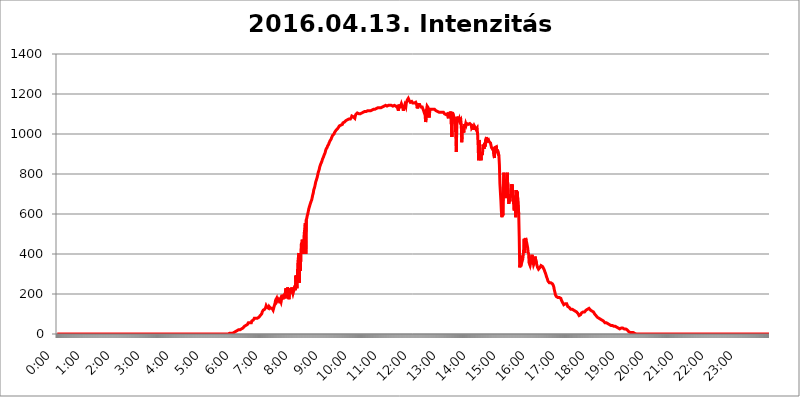
| Category | 2016.04.13. Intenzitás [W/m^2] |
|---|---|
| 0.0 | 0 |
| 0.0006944444444444445 | 0 |
| 0.001388888888888889 | 0 |
| 0.0020833333333333333 | 0 |
| 0.002777777777777778 | 0 |
| 0.003472222222222222 | 0 |
| 0.004166666666666667 | 0 |
| 0.004861111111111111 | 0 |
| 0.005555555555555556 | 0 |
| 0.0062499999999999995 | 0 |
| 0.006944444444444444 | 0 |
| 0.007638888888888889 | 0 |
| 0.008333333333333333 | 0 |
| 0.009027777777777779 | 0 |
| 0.009722222222222222 | 0 |
| 0.010416666666666666 | 0 |
| 0.011111111111111112 | 0 |
| 0.011805555555555555 | 0 |
| 0.012499999999999999 | 0 |
| 0.013194444444444444 | 0 |
| 0.013888888888888888 | 0 |
| 0.014583333333333332 | 0 |
| 0.015277777777777777 | 0 |
| 0.015972222222222224 | 0 |
| 0.016666666666666666 | 0 |
| 0.017361111111111112 | 0 |
| 0.018055555555555557 | 0 |
| 0.01875 | 0 |
| 0.019444444444444445 | 0 |
| 0.02013888888888889 | 0 |
| 0.020833333333333332 | 0 |
| 0.02152777777777778 | 0 |
| 0.022222222222222223 | 0 |
| 0.02291666666666667 | 0 |
| 0.02361111111111111 | 0 |
| 0.024305555555555556 | 0 |
| 0.024999999999999998 | 0 |
| 0.025694444444444447 | 0 |
| 0.02638888888888889 | 0 |
| 0.027083333333333334 | 0 |
| 0.027777777777777776 | 0 |
| 0.02847222222222222 | 0 |
| 0.029166666666666664 | 0 |
| 0.029861111111111113 | 0 |
| 0.030555555555555555 | 0 |
| 0.03125 | 0 |
| 0.03194444444444445 | 0 |
| 0.03263888888888889 | 0 |
| 0.03333333333333333 | 0 |
| 0.034027777777777775 | 0 |
| 0.034722222222222224 | 0 |
| 0.035416666666666666 | 0 |
| 0.036111111111111115 | 0 |
| 0.03680555555555556 | 0 |
| 0.0375 | 0 |
| 0.03819444444444444 | 0 |
| 0.03888888888888889 | 0 |
| 0.03958333333333333 | 0 |
| 0.04027777777777778 | 0 |
| 0.04097222222222222 | 0 |
| 0.041666666666666664 | 0 |
| 0.042361111111111106 | 0 |
| 0.04305555555555556 | 0 |
| 0.043750000000000004 | 0 |
| 0.044444444444444446 | 0 |
| 0.04513888888888889 | 0 |
| 0.04583333333333334 | 0 |
| 0.04652777777777778 | 0 |
| 0.04722222222222222 | 0 |
| 0.04791666666666666 | 0 |
| 0.04861111111111111 | 0 |
| 0.049305555555555554 | 0 |
| 0.049999999999999996 | 0 |
| 0.05069444444444445 | 0 |
| 0.051388888888888894 | 0 |
| 0.052083333333333336 | 0 |
| 0.05277777777777778 | 0 |
| 0.05347222222222222 | 0 |
| 0.05416666666666667 | 0 |
| 0.05486111111111111 | 0 |
| 0.05555555555555555 | 0 |
| 0.05625 | 0 |
| 0.05694444444444444 | 0 |
| 0.057638888888888885 | 0 |
| 0.05833333333333333 | 0 |
| 0.05902777777777778 | 0 |
| 0.059722222222222225 | 0 |
| 0.06041666666666667 | 0 |
| 0.061111111111111116 | 0 |
| 0.06180555555555556 | 0 |
| 0.0625 | 0 |
| 0.06319444444444444 | 0 |
| 0.06388888888888888 | 0 |
| 0.06458333333333334 | 0 |
| 0.06527777777777778 | 0 |
| 0.06597222222222222 | 0 |
| 0.06666666666666667 | 0 |
| 0.06736111111111111 | 0 |
| 0.06805555555555555 | 0 |
| 0.06874999999999999 | 0 |
| 0.06944444444444443 | 0 |
| 0.07013888888888889 | 0 |
| 0.07083333333333333 | 0 |
| 0.07152777777777779 | 0 |
| 0.07222222222222223 | 0 |
| 0.07291666666666667 | 0 |
| 0.07361111111111111 | 0 |
| 0.07430555555555556 | 0 |
| 0.075 | 0 |
| 0.07569444444444444 | 0 |
| 0.0763888888888889 | 0 |
| 0.07708333333333334 | 0 |
| 0.07777777777777778 | 0 |
| 0.07847222222222222 | 0 |
| 0.07916666666666666 | 0 |
| 0.0798611111111111 | 0 |
| 0.08055555555555556 | 0 |
| 0.08125 | 0 |
| 0.08194444444444444 | 0 |
| 0.08263888888888889 | 0 |
| 0.08333333333333333 | 0 |
| 0.08402777777777777 | 0 |
| 0.08472222222222221 | 0 |
| 0.08541666666666665 | 0 |
| 0.08611111111111112 | 0 |
| 0.08680555555555557 | 0 |
| 0.08750000000000001 | 0 |
| 0.08819444444444445 | 0 |
| 0.08888888888888889 | 0 |
| 0.08958333333333333 | 0 |
| 0.09027777777777778 | 0 |
| 0.09097222222222222 | 0 |
| 0.09166666666666667 | 0 |
| 0.09236111111111112 | 0 |
| 0.09305555555555556 | 0 |
| 0.09375 | 0 |
| 0.09444444444444444 | 0 |
| 0.09513888888888888 | 0 |
| 0.09583333333333333 | 0 |
| 0.09652777777777777 | 0 |
| 0.09722222222222222 | 0 |
| 0.09791666666666667 | 0 |
| 0.09861111111111111 | 0 |
| 0.09930555555555555 | 0 |
| 0.09999999999999999 | 0 |
| 0.10069444444444443 | 0 |
| 0.1013888888888889 | 0 |
| 0.10208333333333335 | 0 |
| 0.10277777777777779 | 0 |
| 0.10347222222222223 | 0 |
| 0.10416666666666667 | 0 |
| 0.10486111111111111 | 0 |
| 0.10555555555555556 | 0 |
| 0.10625 | 0 |
| 0.10694444444444444 | 0 |
| 0.1076388888888889 | 0 |
| 0.10833333333333334 | 0 |
| 0.10902777777777778 | 0 |
| 0.10972222222222222 | 0 |
| 0.1111111111111111 | 0 |
| 0.11180555555555556 | 0 |
| 0.11180555555555556 | 0 |
| 0.1125 | 0 |
| 0.11319444444444444 | 0 |
| 0.11388888888888889 | 0 |
| 0.11458333333333333 | 0 |
| 0.11527777777777777 | 0 |
| 0.11597222222222221 | 0 |
| 0.11666666666666665 | 0 |
| 0.1173611111111111 | 0 |
| 0.11805555555555557 | 0 |
| 0.11944444444444445 | 0 |
| 0.12013888888888889 | 0 |
| 0.12083333333333333 | 0 |
| 0.12152777777777778 | 0 |
| 0.12222222222222223 | 0 |
| 0.12291666666666667 | 0 |
| 0.12291666666666667 | 0 |
| 0.12361111111111112 | 0 |
| 0.12430555555555556 | 0 |
| 0.125 | 0 |
| 0.12569444444444444 | 0 |
| 0.12638888888888888 | 0 |
| 0.12708333333333333 | 0 |
| 0.16875 | 0 |
| 0.12847222222222224 | 0 |
| 0.12916666666666668 | 0 |
| 0.12986111111111112 | 0 |
| 0.13055555555555556 | 0 |
| 0.13125 | 0 |
| 0.13194444444444445 | 0 |
| 0.1326388888888889 | 0 |
| 0.13333333333333333 | 0 |
| 0.13402777777777777 | 0 |
| 0.13402777777777777 | 0 |
| 0.13472222222222222 | 0 |
| 0.13541666666666666 | 0 |
| 0.1361111111111111 | 0 |
| 0.13749999999999998 | 0 |
| 0.13819444444444443 | 0 |
| 0.1388888888888889 | 0 |
| 0.13958333333333334 | 0 |
| 0.14027777777777778 | 0 |
| 0.14097222222222222 | 0 |
| 0.14166666666666666 | 0 |
| 0.1423611111111111 | 0 |
| 0.14305555555555557 | 0 |
| 0.14375000000000002 | 0 |
| 0.14444444444444446 | 0 |
| 0.1451388888888889 | 0 |
| 0.1451388888888889 | 0 |
| 0.14652777777777778 | 0 |
| 0.14722222222222223 | 0 |
| 0.14791666666666667 | 0 |
| 0.1486111111111111 | 0 |
| 0.14930555555555555 | 0 |
| 0.15 | 0 |
| 0.15069444444444444 | 0 |
| 0.15138888888888888 | 0 |
| 0.15208333333333332 | 0 |
| 0.15277777777777776 | 0 |
| 0.15347222222222223 | 0 |
| 0.15416666666666667 | 0 |
| 0.15486111111111112 | 0 |
| 0.15555555555555556 | 0 |
| 0.15625 | 0 |
| 0.15694444444444444 | 0 |
| 0.15763888888888888 | 0 |
| 0.15833333333333333 | 0 |
| 0.15902777777777777 | 0 |
| 0.15972222222222224 | 0 |
| 0.16041666666666668 | 0 |
| 0.16111111111111112 | 0 |
| 0.16180555555555556 | 0 |
| 0.1625 | 0 |
| 0.16319444444444445 | 0 |
| 0.1638888888888889 | 0 |
| 0.16458333333333333 | 0 |
| 0.16527777777777777 | 0 |
| 0.16597222222222222 | 0 |
| 0.16666666666666666 | 0 |
| 0.1673611111111111 | 0 |
| 0.16805555555555554 | 0 |
| 0.16874999999999998 | 0 |
| 0.16944444444444443 | 0 |
| 0.17013888888888887 | 0 |
| 0.1708333333333333 | 0 |
| 0.17152777777777775 | 0 |
| 0.17222222222222225 | 0 |
| 0.1729166666666667 | 0 |
| 0.17361111111111113 | 0 |
| 0.17430555555555557 | 0 |
| 0.17500000000000002 | 0 |
| 0.17569444444444446 | 0 |
| 0.1763888888888889 | 0 |
| 0.17708333333333334 | 0 |
| 0.17777777777777778 | 0 |
| 0.17847222222222223 | 0 |
| 0.17916666666666667 | 0 |
| 0.1798611111111111 | 0 |
| 0.18055555555555555 | 0 |
| 0.18125 | 0 |
| 0.18194444444444444 | 0 |
| 0.1826388888888889 | 0 |
| 0.18333333333333335 | 0 |
| 0.1840277777777778 | 0 |
| 0.18472222222222223 | 0 |
| 0.18541666666666667 | 0 |
| 0.18611111111111112 | 0 |
| 0.18680555555555556 | 0 |
| 0.1875 | 0 |
| 0.18819444444444444 | 0 |
| 0.18888888888888888 | 0 |
| 0.18958333333333333 | 0 |
| 0.19027777777777777 | 0 |
| 0.1909722222222222 | 0 |
| 0.19166666666666665 | 0 |
| 0.19236111111111112 | 0 |
| 0.19305555555555554 | 0 |
| 0.19375 | 0 |
| 0.19444444444444445 | 0 |
| 0.1951388888888889 | 0 |
| 0.19583333333333333 | 0 |
| 0.19652777777777777 | 0 |
| 0.19722222222222222 | 0 |
| 0.19791666666666666 | 0 |
| 0.1986111111111111 | 0 |
| 0.19930555555555554 | 0 |
| 0.19999999999999998 | 0 |
| 0.20069444444444443 | 0 |
| 0.20138888888888887 | 0 |
| 0.2020833333333333 | 0 |
| 0.2027777777777778 | 0 |
| 0.2034722222222222 | 0 |
| 0.2041666666666667 | 0 |
| 0.20486111111111113 | 0 |
| 0.20555555555555557 | 0 |
| 0.20625000000000002 | 0 |
| 0.20694444444444446 | 0 |
| 0.2076388888888889 | 0 |
| 0.20833333333333334 | 0 |
| 0.20902777777777778 | 0 |
| 0.20972222222222223 | 0 |
| 0.21041666666666667 | 0 |
| 0.2111111111111111 | 0 |
| 0.21180555555555555 | 0 |
| 0.2125 | 0 |
| 0.21319444444444444 | 0 |
| 0.2138888888888889 | 0 |
| 0.21458333333333335 | 0 |
| 0.2152777777777778 | 0 |
| 0.21597222222222223 | 0 |
| 0.21666666666666667 | 0 |
| 0.21736111111111112 | 0 |
| 0.21805555555555556 | 0 |
| 0.21875 | 0 |
| 0.21944444444444444 | 0 |
| 0.22013888888888888 | 0 |
| 0.22083333333333333 | 0 |
| 0.22152777777777777 | 0 |
| 0.2222222222222222 | 0 |
| 0.22291666666666665 | 0 |
| 0.2236111111111111 | 0 |
| 0.22430555555555556 | 0 |
| 0.225 | 0 |
| 0.22569444444444445 | 0 |
| 0.2263888888888889 | 0 |
| 0.22708333333333333 | 0 |
| 0.22777777777777777 | 0 |
| 0.22847222222222222 | 0 |
| 0.22916666666666666 | 0 |
| 0.2298611111111111 | 0 |
| 0.23055555555555554 | 0 |
| 0.23124999999999998 | 0 |
| 0.23194444444444443 | 0 |
| 0.23263888888888887 | 0 |
| 0.2333333333333333 | 0 |
| 0.2340277777777778 | 0 |
| 0.2347222222222222 | 0 |
| 0.2354166666666667 | 0 |
| 0.23611111111111113 | 0 |
| 0.23680555555555557 | 0 |
| 0.23750000000000002 | 0 |
| 0.23819444444444446 | 0 |
| 0.2388888888888889 | 0 |
| 0.23958333333333334 | 0 |
| 0.24027777777777778 | 3.525 |
| 0.24097222222222223 | 3.525 |
| 0.24166666666666667 | 3.525 |
| 0.2423611111111111 | 3.525 |
| 0.24305555555555555 | 3.525 |
| 0.24375 | 3.525 |
| 0.24444444444444446 | 3.525 |
| 0.24513888888888888 | 3.525 |
| 0.24583333333333335 | 3.525 |
| 0.2465277777777778 | 7.887 |
| 0.24722222222222223 | 7.887 |
| 0.24791666666666667 | 7.887 |
| 0.24861111111111112 | 7.887 |
| 0.24930555555555556 | 7.887 |
| 0.25 | 12.257 |
| 0.25069444444444444 | 12.257 |
| 0.2513888888888889 | 12.257 |
| 0.2520833333333333 | 16.636 |
| 0.25277777777777777 | 16.636 |
| 0.2534722222222222 | 16.636 |
| 0.25416666666666665 | 21.024 |
| 0.2548611111111111 | 21.024 |
| 0.2555555555555556 | 21.024 |
| 0.25625000000000003 | 21.024 |
| 0.2569444444444445 | 25.419 |
| 0.2576388888888889 | 25.419 |
| 0.25833333333333336 | 25.419 |
| 0.2590277777777778 | 29.823 |
| 0.25972222222222224 | 29.823 |
| 0.2604166666666667 | 29.823 |
| 0.2611111111111111 | 34.234 |
| 0.26180555555555557 | 34.234 |
| 0.2625 | 38.653 |
| 0.26319444444444445 | 38.653 |
| 0.2638888888888889 | 38.653 |
| 0.26458333333333334 | 43.079 |
| 0.2652777777777778 | 43.079 |
| 0.2659722222222222 | 47.511 |
| 0.26666666666666666 | 47.511 |
| 0.2673611111111111 | 51.951 |
| 0.26805555555555555 | 56.398 |
| 0.26875 | 56.398 |
| 0.26944444444444443 | 56.398 |
| 0.2701388888888889 | 56.398 |
| 0.2708333333333333 | 56.398 |
| 0.27152777777777776 | 56.398 |
| 0.2722222222222222 | 56.398 |
| 0.27291666666666664 | 65.31 |
| 0.2736111111111111 | 65.31 |
| 0.2743055555555555 | 69.775 |
| 0.27499999999999997 | 69.775 |
| 0.27569444444444446 | 74.246 |
| 0.27638888888888885 | 78.722 |
| 0.27708333333333335 | 83.205 |
| 0.2777777777777778 | 83.205 |
| 0.27847222222222223 | 78.722 |
| 0.2791666666666667 | 78.722 |
| 0.2798611111111111 | 83.205 |
| 0.28055555555555556 | 78.722 |
| 0.28125 | 78.722 |
| 0.28194444444444444 | 83.205 |
| 0.2826388888888889 | 83.205 |
| 0.2833333333333333 | 83.205 |
| 0.28402777777777777 | 83.205 |
| 0.2847222222222222 | 92.184 |
| 0.28541666666666665 | 96.682 |
| 0.28611111111111115 | 92.184 |
| 0.28680555555555554 | 101.184 |
| 0.28750000000000003 | 110.201 |
| 0.2881944444444445 | 114.716 |
| 0.2888888888888889 | 119.235 |
| 0.28958333333333336 | 119.235 |
| 0.2902777777777778 | 123.758 |
| 0.29097222222222224 | 123.758 |
| 0.2916666666666667 | 128.284 |
| 0.2923611111111111 | 132.814 |
| 0.29305555555555557 | 141.884 |
| 0.29375 | 137.347 |
| 0.29444444444444445 | 132.814 |
| 0.2951388888888889 | 132.814 |
| 0.29583333333333334 | 137.347 |
| 0.2965277777777778 | 128.284 |
| 0.2972222222222222 | 137.347 |
| 0.29791666666666666 | 132.814 |
| 0.2986111111111111 | 137.347 |
| 0.29930555555555555 | 128.284 |
| 0.3 | 128.284 |
| 0.30069444444444443 | 123.758 |
| 0.3013888888888889 | 128.284 |
| 0.3020833333333333 | 132.814 |
| 0.30277777777777776 | 119.235 |
| 0.3034722222222222 | 114.716 |
| 0.30416666666666664 | 137.347 |
| 0.3048611111111111 | 137.347 |
| 0.3055555555555555 | 155.509 |
| 0.30624999999999997 | 169.156 |
| 0.3069444444444444 | 173.709 |
| 0.3076388888888889 | 178.264 |
| 0.30833333333333335 | 164.605 |
| 0.3090277777777778 | 164.605 |
| 0.30972222222222223 | 173.709 |
| 0.3104166666666667 | 173.709 |
| 0.3111111111111111 | 164.605 |
| 0.31180555555555556 | 169.156 |
| 0.3125 | 173.709 |
| 0.31319444444444444 | 178.264 |
| 0.3138888888888889 | 160.056 |
| 0.3145833333333333 | 173.709 |
| 0.31527777777777777 | 196.497 |
| 0.3159722222222222 | 196.497 |
| 0.31666666666666665 | 173.709 |
| 0.31736111111111115 | 187.378 |
| 0.31805555555555554 | 187.378 |
| 0.31875000000000003 | 196.497 |
| 0.3194444444444445 | 182.82 |
| 0.3201388888888889 | 214.746 |
| 0.32083333333333336 | 228.436 |
| 0.3215277777777778 | 178.264 |
| 0.32222222222222224 | 214.746 |
| 0.3229166666666667 | 233 |
| 0.3236111111111111 | 228.436 |
| 0.32430555555555557 | 214.746 |
| 0.325 | 173.709 |
| 0.32569444444444445 | 214.746 |
| 0.3263888888888889 | 201.058 |
| 0.32708333333333334 | 228.436 |
| 0.3277777777777778 | 214.746 |
| 0.3284722222222222 | 223.873 |
| 0.32916666666666666 | 233 |
| 0.3298611111111111 | 210.182 |
| 0.33055555555555555 | 201.058 |
| 0.33125 | 201.058 |
| 0.33194444444444443 | 196.497 |
| 0.3326388888888889 | 228.436 |
| 0.3333333333333333 | 242.127 |
| 0.3340277777777778 | 219.309 |
| 0.3347222222222222 | 292.259 |
| 0.3354166666666667 | 255.813 |
| 0.3361111111111111 | 228.436 |
| 0.3368055555555556 | 296.808 |
| 0.33749999999999997 | 355.712 |
| 0.33819444444444446 | 382.715 |
| 0.33888888888888885 | 405.108 |
| 0.33958333333333335 | 255.813 |
| 0.34027777777777773 | 378.224 |
| 0.34097222222222223 | 314.98 |
| 0.3416666666666666 | 400.638 |
| 0.3423611111111111 | 449.551 |
| 0.3430555555555555 | 458.38 |
| 0.34375 | 471.582 |
| 0.3444444444444445 | 400.638 |
| 0.3451388888888889 | 414.035 |
| 0.3458333333333334 | 471.582 |
| 0.34652777777777777 | 506.542 |
| 0.34722222222222227 | 528.2 |
| 0.34791666666666665 | 553.986 |
| 0.34861111111111115 | 400.638 |
| 0.34930555555555554 | 571.049 |
| 0.35000000000000003 | 579.542 |
| 0.3506944444444444 | 592.233 |
| 0.3513888888888889 | 600.661 |
| 0.3520833333333333 | 613.252 |
| 0.3527777777777778 | 625.784 |
| 0.3534722222222222 | 634.105 |
| 0.3541666666666667 | 642.4 |
| 0.3548611111111111 | 646.537 |
| 0.35555555555555557 | 658.909 |
| 0.35625 | 663.019 |
| 0.35694444444444445 | 671.22 |
| 0.3576388888888889 | 683.473 |
| 0.35833333333333334 | 695.666 |
| 0.3590277777777778 | 703.762 |
| 0.3597222222222222 | 719.877 |
| 0.36041666666666666 | 723.889 |
| 0.3611111111111111 | 735.89 |
| 0.36180555555555555 | 747.834 |
| 0.3625 | 759.723 |
| 0.36319444444444443 | 763.674 |
| 0.3638888888888889 | 775.492 |
| 0.3645833333333333 | 783.342 |
| 0.3652777777777778 | 795.074 |
| 0.3659722222222222 | 806.757 |
| 0.3666666666666667 | 814.519 |
| 0.3673611111111111 | 822.26 |
| 0.3680555555555556 | 833.834 |
| 0.36874999999999997 | 841.526 |
| 0.36944444444444446 | 849.199 |
| 0.37013888888888885 | 845.365 |
| 0.37083333333333335 | 860.676 |
| 0.37152777777777773 | 868.305 |
| 0.37222222222222223 | 875.918 |
| 0.3729166666666666 | 879.719 |
| 0.3736111111111111 | 887.309 |
| 0.3743055555555555 | 894.885 |
| 0.375 | 898.668 |
| 0.3756944444444445 | 906.223 |
| 0.3763888888888889 | 917.534 |
| 0.3770833333333334 | 925.06 |
| 0.37777777777777777 | 928.819 |
| 0.37847222222222227 | 932.576 |
| 0.37916666666666665 | 940.082 |
| 0.37986111111111115 | 943.832 |
| 0.38055555555555554 | 947.58 |
| 0.38125000000000003 | 955.071 |
| 0.3819444444444444 | 958.814 |
| 0.3826388888888889 | 966.295 |
| 0.3833333333333333 | 970.034 |
| 0.3840277777777778 | 973.772 |
| 0.3847222222222222 | 981.244 |
| 0.3854166666666667 | 984.98 |
| 0.3861111111111111 | 992.448 |
| 0.38680555555555557 | 996.182 |
| 0.3875 | 996.182 |
| 0.38819444444444445 | 999.916 |
| 0.3888888888888889 | 1007.383 |
| 0.38958333333333334 | 1007.383 |
| 0.3902777777777778 | 1011.118 |
| 0.3909722222222222 | 1018.587 |
| 0.39166666666666666 | 1018.587 |
| 0.3923611111111111 | 1022.323 |
| 0.39305555555555555 | 1026.06 |
| 0.39375 | 1029.798 |
| 0.39444444444444443 | 1033.537 |
| 0.3951388888888889 | 1033.537 |
| 0.3958333333333333 | 1041.019 |
| 0.3965277777777778 | 1041.019 |
| 0.3972222222222222 | 1044.762 |
| 0.3979166666666667 | 1044.762 |
| 0.3986111111111111 | 1044.762 |
| 0.3993055555555556 | 1048.508 |
| 0.39999999999999997 | 1048.508 |
| 0.40069444444444446 | 1056.004 |
| 0.40138888888888885 | 1056.004 |
| 0.40208333333333335 | 1056.004 |
| 0.40277777777777773 | 1059.756 |
| 0.40347222222222223 | 1059.756 |
| 0.4041666666666666 | 1063.51 |
| 0.4048611111111111 | 1067.267 |
| 0.4055555555555555 | 1071.027 |
| 0.40625 | 1071.027 |
| 0.4069444444444445 | 1071.027 |
| 0.4076388888888889 | 1071.027 |
| 0.4083333333333334 | 1071.027 |
| 0.40902777777777777 | 1074.789 |
| 0.40972222222222227 | 1074.789 |
| 0.41041666666666665 | 1078.555 |
| 0.41111111111111115 | 1074.789 |
| 0.41180555555555554 | 1078.555 |
| 0.41250000000000003 | 1082.324 |
| 0.4131944444444444 | 1089.873 |
| 0.4138888888888889 | 1086.097 |
| 0.4145833333333333 | 1086.097 |
| 0.4152777777777778 | 1086.097 |
| 0.4159722222222222 | 1086.097 |
| 0.4166666666666667 | 1089.873 |
| 0.4173611111111111 | 1078.555 |
| 0.41805555555555557 | 1089.873 |
| 0.41875 | 1097.437 |
| 0.41944444444444445 | 1097.437 |
| 0.4201388888888889 | 1097.437 |
| 0.42083333333333334 | 1105.019 |
| 0.4215277777777778 | 1108.816 |
| 0.4222222222222222 | 1108.816 |
| 0.42291666666666666 | 1101.226 |
| 0.4236111111111111 | 1101.226 |
| 0.42430555555555555 | 1101.226 |
| 0.425 | 1101.226 |
| 0.42569444444444443 | 1101.226 |
| 0.4263888888888889 | 1105.019 |
| 0.4270833333333333 | 1105.019 |
| 0.4277777777777778 | 1105.019 |
| 0.4284722222222222 | 1105.019 |
| 0.4291666666666667 | 1108.816 |
| 0.4298611111111111 | 1108.816 |
| 0.4305555555555556 | 1108.816 |
| 0.43124999999999997 | 1112.618 |
| 0.43194444444444446 | 1112.618 |
| 0.43263888888888885 | 1108.816 |
| 0.43333333333333335 | 1112.618 |
| 0.43402777777777773 | 1108.816 |
| 0.43472222222222223 | 1112.618 |
| 0.4354166666666666 | 1116.426 |
| 0.4361111111111111 | 1116.426 |
| 0.4368055555555555 | 1116.426 |
| 0.4375 | 1116.426 |
| 0.4381944444444445 | 1116.426 |
| 0.4388888888888889 | 1116.426 |
| 0.4395833333333334 | 1116.426 |
| 0.44027777777777777 | 1116.426 |
| 0.44097222222222227 | 1116.426 |
| 0.44166666666666665 | 1120.238 |
| 0.44236111111111115 | 1124.056 |
| 0.44305555555555554 | 1124.056 |
| 0.44375000000000003 | 1124.056 |
| 0.4444444444444444 | 1124.056 |
| 0.4451388888888889 | 1124.056 |
| 0.4458333333333333 | 1124.056 |
| 0.4465277777777778 | 1124.056 |
| 0.4472222222222222 | 1127.879 |
| 0.4479166666666667 | 1127.879 |
| 0.4486111111111111 | 1127.879 |
| 0.44930555555555557 | 1131.708 |
| 0.45 | 1131.708 |
| 0.45069444444444445 | 1131.708 |
| 0.4513888888888889 | 1135.543 |
| 0.45208333333333334 | 1131.708 |
| 0.4527777777777778 | 1131.708 |
| 0.4534722222222222 | 1135.543 |
| 0.45416666666666666 | 1131.708 |
| 0.4548611111111111 | 1135.543 |
| 0.45555555555555555 | 1135.543 |
| 0.45625 | 1135.543 |
| 0.45694444444444443 | 1139.384 |
| 0.4576388888888889 | 1139.384 |
| 0.4583333333333333 | 1139.384 |
| 0.4590277777777778 | 1139.384 |
| 0.4597222222222222 | 1143.232 |
| 0.4604166666666667 | 1143.232 |
| 0.4611111111111111 | 1143.232 |
| 0.4618055555555556 | 1139.384 |
| 0.46249999999999997 | 1139.384 |
| 0.46319444444444446 | 1139.384 |
| 0.46388888888888885 | 1143.232 |
| 0.46458333333333335 | 1143.232 |
| 0.46527777777777773 | 1147.086 |
| 0.46597222222222223 | 1143.232 |
| 0.4666666666666666 | 1143.232 |
| 0.4673611111111111 | 1139.384 |
| 0.4680555555555555 | 1139.384 |
| 0.46875 | 1143.232 |
| 0.4694444444444445 | 1147.086 |
| 0.4701388888888889 | 1147.086 |
| 0.4708333333333334 | 1139.384 |
| 0.47152777777777777 | 1139.384 |
| 0.47222222222222227 | 1139.384 |
| 0.47291666666666665 | 1143.232 |
| 0.47361111111111115 | 1143.232 |
| 0.47430555555555554 | 1143.232 |
| 0.47500000000000003 | 1139.384 |
| 0.4756944444444444 | 1135.543 |
| 0.4763888888888889 | 1139.384 |
| 0.4770833333333333 | 1131.708 |
| 0.4777777777777778 | 1131.708 |
| 0.4784722222222222 | 1116.426 |
| 0.4791666666666667 | 1147.086 |
| 0.4798611111111111 | 1143.232 |
| 0.48055555555555557 | 1135.543 |
| 0.48125 | 1131.708 |
| 0.48194444444444445 | 1143.232 |
| 0.4826388888888889 | 1150.946 |
| 0.48333333333333334 | 1147.086 |
| 0.4840277777777778 | 1135.543 |
| 0.4847222222222222 | 1127.879 |
| 0.48541666666666666 | 1116.426 |
| 0.4861111111111111 | 1131.708 |
| 0.48680555555555555 | 1131.708 |
| 0.4875 | 1147.086 |
| 0.48819444444444443 | 1147.086 |
| 0.4888888888888889 | 1135.543 |
| 0.4895833333333333 | 1154.814 |
| 0.4902777777777778 | 1154.814 |
| 0.4909722222222222 | 1170.358 |
| 0.4916666666666667 | 1174.263 |
| 0.4923611111111111 | 1178.177 |
| 0.4930555555555556 | 1174.263 |
| 0.49374999999999997 | 1166.46 |
| 0.49444444444444446 | 1162.571 |
| 0.49513888888888885 | 1158.689 |
| 0.49583333333333335 | 1158.689 |
| 0.49652777777777773 | 1154.814 |
| 0.49722222222222223 | 1162.571 |
| 0.4979166666666666 | 1162.571 |
| 0.4986111111111111 | 1154.814 |
| 0.4993055555555555 | 1154.814 |
| 0.5 | 1154.814 |
| 0.5006944444444444 | 1154.814 |
| 0.5013888888888889 | 1150.946 |
| 0.5020833333333333 | 1154.814 |
| 0.5027777777777778 | 1158.689 |
| 0.5034722222222222 | 1154.814 |
| 0.5041666666666667 | 1147.086 |
| 0.5048611111111111 | 1127.879 |
| 0.5055555555555555 | 1127.879 |
| 0.50625 | 1147.086 |
| 0.5069444444444444 | 1147.086 |
| 0.5076388888888889 | 1147.086 |
| 0.5083333333333333 | 1147.086 |
| 0.5090277777777777 | 1143.232 |
| 0.5097222222222222 | 1135.543 |
| 0.5104166666666666 | 1135.543 |
| 0.5111111111111112 | 1135.543 |
| 0.5118055555555555 | 1135.543 |
| 0.5125000000000001 | 1135.543 |
| 0.5131944444444444 | 1139.384 |
| 0.513888888888889 | 1116.426 |
| 0.5145833333333333 | 1116.426 |
| 0.5152777777777778 | 1116.426 |
| 0.5159722222222222 | 1093.653 |
| 0.5166666666666667 | 1059.756 |
| 0.517361111111111 | 1078.555 |
| 0.5180555555555556 | 1124.056 |
| 0.5187499999999999 | 1139.384 |
| 0.5194444444444445 | 1135.543 |
| 0.5201388888888888 | 1131.708 |
| 0.5208333333333334 | 1131.708 |
| 0.5215277777777778 | 1082.324 |
| 0.5222222222222223 | 1105.019 |
| 0.5229166666666667 | 1124.056 |
| 0.5236111111111111 | 1124.056 |
| 0.5243055555555556 | 1120.238 |
| 0.525 | 1124.056 |
| 0.5256944444444445 | 1124.056 |
| 0.5263888888888889 | 1120.238 |
| 0.5270833333333333 | 1124.056 |
| 0.5277777777777778 | 1124.056 |
| 0.5284722222222222 | 1124.056 |
| 0.5291666666666667 | 1124.056 |
| 0.5298611111111111 | 1120.238 |
| 0.5305555555555556 | 1124.056 |
| 0.53125 | 1116.426 |
| 0.5319444444444444 | 1116.426 |
| 0.5326388888888889 | 1116.426 |
| 0.5333333333333333 | 1112.618 |
| 0.5340277777777778 | 1116.426 |
| 0.5347222222222222 | 1112.618 |
| 0.5354166666666667 | 1108.816 |
| 0.5361111111111111 | 1108.816 |
| 0.5368055555555555 | 1108.816 |
| 0.5375 | 1108.816 |
| 0.5381944444444444 | 1108.816 |
| 0.5388888888888889 | 1108.816 |
| 0.5395833333333333 | 1108.816 |
| 0.5402777777777777 | 1108.816 |
| 0.5409722222222222 | 1108.816 |
| 0.5416666666666666 | 1108.816 |
| 0.5423611111111112 | 1105.019 |
| 0.5430555555555555 | 1101.226 |
| 0.5437500000000001 | 1097.437 |
| 0.5444444444444444 | 1097.437 |
| 0.545138888888889 | 1097.437 |
| 0.5458333333333333 | 1101.226 |
| 0.5465277777777778 | 1093.653 |
| 0.5472222222222222 | 1101.226 |
| 0.5479166666666667 | 1086.097 |
| 0.548611111111111 | 1078.555 |
| 0.5493055555555556 | 1101.226 |
| 0.5499999999999999 | 1101.226 |
| 0.5506944444444445 | 1105.019 |
| 0.5513888888888888 | 1105.019 |
| 0.5520833333333334 | 1112.618 |
| 0.5527777777777778 | 1112.618 |
| 0.5534722222222223 | 984.98 |
| 0.5541666666666667 | 1108.816 |
| 0.5548611111111111 | 1105.019 |
| 0.5555555555555556 | 1093.653 |
| 0.55625 | 1086.097 |
| 0.5569444444444445 | 1086.097 |
| 0.5576388888888889 | 1059.756 |
| 0.5583333333333333 | 1044.762 |
| 0.5590277777777778 | 984.98 |
| 0.5597222222222222 | 909.996 |
| 0.5604166666666667 | 1086.097 |
| 0.5611111111111111 | 1086.097 |
| 0.5618055555555556 | 1074.789 |
| 0.5625 | 1071.027 |
| 0.5631944444444444 | 1067.267 |
| 0.5638888888888889 | 1074.789 |
| 0.5645833333333333 | 1063.51 |
| 0.5652777777777778 | 1063.51 |
| 0.5659722222222222 | 1071.027 |
| 0.5666666666666667 | 1044.762 |
| 0.5673611111111111 | 958.814 |
| 0.5680555555555555 | 1029.798 |
| 0.56875 | 1022.323 |
| 0.5694444444444444 | 1037.277 |
| 0.5701388888888889 | 1007.383 |
| 0.5708333333333333 | 1048.508 |
| 0.5715277777777777 | 1029.798 |
| 0.5722222222222222 | 1041.019 |
| 0.5729166666666666 | 1052.255 |
| 0.5736111111111112 | 1044.762 |
| 0.5743055555555555 | 1052.255 |
| 0.5750000000000001 | 1056.004 |
| 0.5756944444444444 | 1052.255 |
| 0.576388888888889 | 1048.508 |
| 0.5770833333333333 | 1048.508 |
| 0.5777777777777778 | 1052.255 |
| 0.5784722222222222 | 1052.255 |
| 0.5791666666666667 | 1052.255 |
| 0.579861111111111 | 1048.508 |
| 0.5805555555555556 | 1044.762 |
| 0.5812499999999999 | 1029.798 |
| 0.5819444444444445 | 1026.06 |
| 0.5826388888888888 | 1037.277 |
| 0.5833333333333334 | 1022.323 |
| 0.5840277777777778 | 1041.019 |
| 0.5847222222222223 | 1022.323 |
| 0.5854166666666667 | 1037.277 |
| 0.5861111111111111 | 1037.277 |
| 0.5868055555555556 | 1041.019 |
| 0.5875 | 1022.323 |
| 0.5881944444444445 | 1022.323 |
| 0.5888888888888889 | 1029.798 |
| 0.5895833333333333 | 996.182 |
| 0.5902777777777778 | 947.58 |
| 0.5909722222222222 | 868.305 |
| 0.5916666666666667 | 970.034 |
| 0.5923611111111111 | 943.832 |
| 0.5930555555555556 | 894.885 |
| 0.59375 | 879.719 |
| 0.5944444444444444 | 868.305 |
| 0.5951388888888889 | 909.996 |
| 0.5958333333333333 | 894.885 |
| 0.5965277777777778 | 906.223 |
| 0.5972222222222222 | 947.58 |
| 0.5979166666666667 | 943.832 |
| 0.5986111111111111 | 925.06 |
| 0.5993055555555555 | 955.071 |
| 0.6 | 936.33 |
| 0.6006944444444444 | 970.034 |
| 0.6013888888888889 | 977.508 |
| 0.6020833333333333 | 984.98 |
| 0.6027777777777777 | 962.555 |
| 0.6034722222222222 | 958.814 |
| 0.6041666666666666 | 966.295 |
| 0.6048611111111112 | 970.034 |
| 0.6055555555555555 | 962.555 |
| 0.6062500000000001 | 962.555 |
| 0.6069444444444444 | 958.814 |
| 0.607638888888889 | 955.071 |
| 0.6083333333333333 | 943.832 |
| 0.6090277777777778 | 932.576 |
| 0.6097222222222222 | 932.576 |
| 0.6104166666666667 | 925.06 |
| 0.611111111111111 | 932.576 |
| 0.6118055555555556 | 932.576 |
| 0.6124999999999999 | 932.576 |
| 0.6131944444444445 | 879.719 |
| 0.6138888888888888 | 932.576 |
| 0.6145833333333334 | 932.576 |
| 0.6152777777777778 | 936.33 |
| 0.6159722222222223 | 936.33 |
| 0.6166666666666667 | 906.223 |
| 0.6173611111111111 | 921.298 |
| 0.6180555555555556 | 925.06 |
| 0.61875 | 917.534 |
| 0.6194444444444445 | 891.099 |
| 0.6201388888888889 | 845.365 |
| 0.6208333333333333 | 751.803 |
| 0.6215277777777778 | 751.803 |
| 0.6222222222222222 | 667.123 |
| 0.6229166666666667 | 613.252 |
| 0.6236111111111111 | 583.779 |
| 0.6243055555555556 | 609.062 |
| 0.625 | 592.233 |
| 0.6256944444444444 | 735.89 |
| 0.6263888888888889 | 806.757 |
| 0.6270833333333333 | 691.608 |
| 0.6277777777777778 | 711.832 |
| 0.6284722222222222 | 679.395 |
| 0.6291666666666667 | 675.311 |
| 0.6298611111111111 | 763.674 |
| 0.6305555555555555 | 759.723 |
| 0.63125 | 806.757 |
| 0.6319444444444444 | 723.889 |
| 0.6326388888888889 | 687.544 |
| 0.6333333333333333 | 650.667 |
| 0.6340277777777777 | 675.311 |
| 0.6347222222222222 | 663.019 |
| 0.6354166666666666 | 699.717 |
| 0.6361111111111112 | 683.473 |
| 0.6368055555555555 | 747.834 |
| 0.6375000000000001 | 735.89 |
| 0.6381944444444444 | 747.834 |
| 0.638888888888889 | 743.859 |
| 0.6395833333333333 | 667.123 |
| 0.6402777777777778 | 642.4 |
| 0.6409722222222222 | 617.436 |
| 0.6416666666666667 | 691.608 |
| 0.642361111111111 | 667.123 |
| 0.6430555555555556 | 583.779 |
| 0.6437499999999999 | 719.877 |
| 0.6444444444444445 | 650.667 |
| 0.6451388888888888 | 711.832 |
| 0.6458333333333334 | 711.832 |
| 0.6465277777777778 | 715.858 |
| 0.6472222222222223 | 600.661 |
| 0.6479166666666667 | 489.108 |
| 0.6486111111111111 | 333.113 |
| 0.6493055555555556 | 346.682 |
| 0.65 | 337.639 |
| 0.6506944444444445 | 391.685 |
| 0.6513888888888889 | 373.729 |
| 0.6520833333333333 | 364.728 |
| 0.6527777777777778 | 373.729 |
| 0.6534722222222222 | 391.685 |
| 0.6541666666666667 | 422.943 |
| 0.6548611111111111 | 475.972 |
| 0.6555555555555556 | 405.108 |
| 0.65625 | 467.187 |
| 0.6569444444444444 | 480.356 |
| 0.6576388888888889 | 467.187 |
| 0.6583333333333333 | 458.38 |
| 0.6590277777777778 | 445.129 |
| 0.6597222222222222 | 431.833 |
| 0.6604166666666667 | 409.574 |
| 0.6611111111111111 | 400.638 |
| 0.6618055555555555 | 355.712 |
| 0.6625 | 355.712 |
| 0.6631944444444444 | 342.162 |
| 0.6638888888888889 | 346.682 |
| 0.6645833333333333 | 364.728 |
| 0.6652777777777777 | 378.224 |
| 0.6659722222222222 | 396.164 |
| 0.6666666666666666 | 373.729 |
| 0.6673611111111111 | 373.729 |
| 0.6680555555555556 | 346.682 |
| 0.6687500000000001 | 346.682 |
| 0.6694444444444444 | 360.221 |
| 0.6701388888888888 | 387.202 |
| 0.6708333333333334 | 387.202 |
| 0.6715277777777778 | 382.715 |
| 0.6722222222222222 | 351.198 |
| 0.6729166666666666 | 342.162 |
| 0.6736111111111112 | 333.113 |
| 0.6743055555555556 | 328.584 |
| 0.6749999999999999 | 324.052 |
| 0.6756944444444444 | 324.052 |
| 0.6763888888888889 | 319.517 |
| 0.6770833333333334 | 333.113 |
| 0.6777777777777777 | 337.639 |
| 0.6784722222222223 | 342.162 |
| 0.6791666666666667 | 342.162 |
| 0.6798611111111111 | 342.162 |
| 0.6805555555555555 | 337.639 |
| 0.68125 | 333.113 |
| 0.6819444444444445 | 333.113 |
| 0.6826388888888889 | 324.052 |
| 0.6833333333333332 | 324.052 |
| 0.6840277777777778 | 310.44 |
| 0.6847222222222222 | 305.898 |
| 0.6854166666666667 | 296.808 |
| 0.686111111111111 | 287.709 |
| 0.6868055555555556 | 283.156 |
| 0.6875 | 274.047 |
| 0.6881944444444444 | 264.932 |
| 0.688888888888889 | 260.373 |
| 0.6895833333333333 | 260.373 |
| 0.6902777777777778 | 255.813 |
| 0.6909722222222222 | 251.251 |
| 0.6916666666666668 | 255.813 |
| 0.6923611111111111 | 255.813 |
| 0.6930555555555555 | 255.813 |
| 0.69375 | 255.813 |
| 0.6944444444444445 | 251.251 |
| 0.6951388888888889 | 246.689 |
| 0.6958333333333333 | 242.127 |
| 0.6965277777777777 | 233 |
| 0.6972222222222223 | 219.309 |
| 0.6979166666666666 | 210.182 |
| 0.6986111111111111 | 196.497 |
| 0.6993055555555556 | 191.937 |
| 0.7000000000000001 | 187.378 |
| 0.7006944444444444 | 187.378 |
| 0.7013888888888888 | 187.378 |
| 0.7020833333333334 | 182.82 |
| 0.7027777777777778 | 182.82 |
| 0.7034722222222222 | 182.82 |
| 0.7041666666666666 | 182.82 |
| 0.7048611111111112 | 182.82 |
| 0.7055555555555556 | 182.82 |
| 0.7062499999999999 | 178.264 |
| 0.7069444444444444 | 173.709 |
| 0.7076388888888889 | 164.605 |
| 0.7083333333333334 | 160.056 |
| 0.7090277777777777 | 155.509 |
| 0.7097222222222223 | 150.964 |
| 0.7104166666666667 | 146.423 |
| 0.7111111111111111 | 146.423 |
| 0.7118055555555555 | 146.423 |
| 0.7125 | 150.964 |
| 0.7131944444444445 | 155.509 |
| 0.7138888888888889 | 155.509 |
| 0.7145833333333332 | 150.964 |
| 0.7152777777777778 | 146.423 |
| 0.7159722222222222 | 137.347 |
| 0.7166666666666667 | 132.814 |
| 0.717361111111111 | 132.814 |
| 0.7180555555555556 | 132.814 |
| 0.71875 | 128.284 |
| 0.7194444444444444 | 128.284 |
| 0.720138888888889 | 123.758 |
| 0.7208333333333333 | 123.758 |
| 0.7215277777777778 | 123.758 |
| 0.7222222222222222 | 123.758 |
| 0.7229166666666668 | 123.758 |
| 0.7236111111111111 | 123.758 |
| 0.7243055555555555 | 119.235 |
| 0.725 | 119.235 |
| 0.7256944444444445 | 114.716 |
| 0.7263888888888889 | 114.716 |
| 0.7270833333333333 | 110.201 |
| 0.7277777777777777 | 110.201 |
| 0.7284722222222223 | 110.201 |
| 0.7291666666666666 | 110.201 |
| 0.7298611111111111 | 110.201 |
| 0.7305555555555556 | 101.184 |
| 0.7312500000000001 | 96.682 |
| 0.7319444444444444 | 92.184 |
| 0.7326388888888888 | 92.184 |
| 0.7333333333333334 | 92.184 |
| 0.7340277777777778 | 96.682 |
| 0.7347222222222222 | 101.184 |
| 0.7354166666666666 | 105.69 |
| 0.7361111111111112 | 110.201 |
| 0.7368055555555556 | 110.201 |
| 0.7374999999999999 | 110.201 |
| 0.7381944444444444 | 110.201 |
| 0.7388888888888889 | 110.201 |
| 0.7395833333333334 | 110.201 |
| 0.7402777777777777 | 114.716 |
| 0.7409722222222223 | 114.716 |
| 0.7416666666666667 | 119.235 |
| 0.7423611111111111 | 119.235 |
| 0.7430555555555555 | 123.758 |
| 0.74375 | 123.758 |
| 0.7444444444444445 | 128.284 |
| 0.7451388888888889 | 128.284 |
| 0.7458333333333332 | 128.284 |
| 0.7465277777777778 | 123.758 |
| 0.7472222222222222 | 123.758 |
| 0.7479166666666667 | 119.235 |
| 0.748611111111111 | 119.235 |
| 0.7493055555555556 | 119.235 |
| 0.75 | 114.716 |
| 0.7506944444444444 | 114.716 |
| 0.751388888888889 | 110.201 |
| 0.7520833333333333 | 110.201 |
| 0.7527777777777778 | 105.69 |
| 0.7534722222222222 | 101.184 |
| 0.7541666666666668 | 101.184 |
| 0.7548611111111111 | 96.682 |
| 0.7555555555555555 | 92.184 |
| 0.75625 | 92.184 |
| 0.7569444444444445 | 87.692 |
| 0.7576388888888889 | 83.205 |
| 0.7583333333333333 | 83.205 |
| 0.7590277777777777 | 78.722 |
| 0.7597222222222223 | 78.722 |
| 0.7604166666666666 | 78.722 |
| 0.7611111111111111 | 74.246 |
| 0.7618055555555556 | 74.246 |
| 0.7625000000000001 | 74.246 |
| 0.7631944444444444 | 74.246 |
| 0.7638888888888888 | 69.775 |
| 0.7645833333333334 | 69.775 |
| 0.7652777777777778 | 65.31 |
| 0.7659722222222222 | 65.31 |
| 0.7666666666666666 | 60.85 |
| 0.7673611111111112 | 60.85 |
| 0.7680555555555556 | 56.398 |
| 0.7687499999999999 | 56.398 |
| 0.7694444444444444 | 56.398 |
| 0.7701388888888889 | 56.398 |
| 0.7708333333333334 | 56.398 |
| 0.7715277777777777 | 51.951 |
| 0.7722222222222223 | 51.951 |
| 0.7729166666666667 | 51.951 |
| 0.7736111111111111 | 51.951 |
| 0.7743055555555555 | 47.511 |
| 0.775 | 47.511 |
| 0.7756944444444445 | 47.511 |
| 0.7763888888888889 | 43.079 |
| 0.7770833333333332 | 43.079 |
| 0.7777777777777778 | 43.079 |
| 0.7784722222222222 | 43.079 |
| 0.7791666666666667 | 43.079 |
| 0.779861111111111 | 38.653 |
| 0.7805555555555556 | 38.653 |
| 0.78125 | 38.653 |
| 0.7819444444444444 | 38.653 |
| 0.782638888888889 | 38.653 |
| 0.7833333333333333 | 38.653 |
| 0.7840277777777778 | 34.234 |
| 0.7847222222222222 | 34.234 |
| 0.7854166666666668 | 34.234 |
| 0.7861111111111111 | 29.823 |
| 0.7868055555555555 | 29.823 |
| 0.7875 | 29.823 |
| 0.7881944444444445 | 29.823 |
| 0.7888888888888889 | 25.419 |
| 0.7895833333333333 | 25.419 |
| 0.7902777777777777 | 29.823 |
| 0.7909722222222223 | 29.823 |
| 0.7916666666666666 | 29.823 |
| 0.7923611111111111 | 29.823 |
| 0.7930555555555556 | 29.823 |
| 0.7937500000000001 | 29.823 |
| 0.7944444444444444 | 29.823 |
| 0.7951388888888888 | 25.419 |
| 0.7958333333333334 | 25.419 |
| 0.7965277777777778 | 25.419 |
| 0.7972222222222222 | 25.419 |
| 0.7979166666666666 | 21.024 |
| 0.7986111111111112 | 21.024 |
| 0.7993055555555556 | 21.024 |
| 0.7999999999999999 | 16.636 |
| 0.8006944444444444 | 16.636 |
| 0.8013888888888889 | 12.257 |
| 0.8020833333333334 | 12.257 |
| 0.8027777777777777 | 12.257 |
| 0.8034722222222223 | 7.887 |
| 0.8041666666666667 | 7.887 |
| 0.8048611111111111 | 7.887 |
| 0.8055555555555555 | 7.887 |
| 0.80625 | 7.887 |
| 0.8069444444444445 | 7.887 |
| 0.8076388888888889 | 7.887 |
| 0.8083333333333332 | 7.887 |
| 0.8090277777777778 | 3.525 |
| 0.8097222222222222 | 3.525 |
| 0.8104166666666667 | 3.525 |
| 0.811111111111111 | 0 |
| 0.8118055555555556 | 0 |
| 0.8125 | 0 |
| 0.8131944444444444 | 0 |
| 0.813888888888889 | 0 |
| 0.8145833333333333 | 0 |
| 0.8152777777777778 | 0 |
| 0.8159722222222222 | 0 |
| 0.8166666666666668 | 0 |
| 0.8173611111111111 | 0 |
| 0.8180555555555555 | 0 |
| 0.81875 | 0 |
| 0.8194444444444445 | 0 |
| 0.8201388888888889 | 0 |
| 0.8208333333333333 | 0 |
| 0.8215277777777777 | 0 |
| 0.8222222222222223 | 0 |
| 0.8229166666666666 | 0 |
| 0.8236111111111111 | 0 |
| 0.8243055555555556 | 0 |
| 0.8250000000000001 | 0 |
| 0.8256944444444444 | 0 |
| 0.8263888888888888 | 0 |
| 0.8270833333333334 | 0 |
| 0.8277777777777778 | 0 |
| 0.8284722222222222 | 0 |
| 0.8291666666666666 | 0 |
| 0.8298611111111112 | 0 |
| 0.8305555555555556 | 0 |
| 0.8312499999999999 | 0 |
| 0.8319444444444444 | 0 |
| 0.8326388888888889 | 0 |
| 0.8333333333333334 | 0 |
| 0.8340277777777777 | 0 |
| 0.8347222222222223 | 0 |
| 0.8354166666666667 | 0 |
| 0.8361111111111111 | 0 |
| 0.8368055555555555 | 0 |
| 0.8375 | 0 |
| 0.8381944444444445 | 0 |
| 0.8388888888888889 | 0 |
| 0.8395833333333332 | 0 |
| 0.8402777777777778 | 0 |
| 0.8409722222222222 | 0 |
| 0.8416666666666667 | 0 |
| 0.842361111111111 | 0 |
| 0.8430555555555556 | 0 |
| 0.84375 | 0 |
| 0.8444444444444444 | 0 |
| 0.845138888888889 | 0 |
| 0.8458333333333333 | 0 |
| 0.8465277777777778 | 0 |
| 0.8472222222222222 | 0 |
| 0.8479166666666668 | 0 |
| 0.8486111111111111 | 0 |
| 0.8493055555555555 | 0 |
| 0.85 | 0 |
| 0.8506944444444445 | 0 |
| 0.8513888888888889 | 0 |
| 0.8520833333333333 | 0 |
| 0.8527777777777777 | 0 |
| 0.8534722222222223 | 0 |
| 0.8541666666666666 | 0 |
| 0.8548611111111111 | 0 |
| 0.8555555555555556 | 0 |
| 0.8562500000000001 | 0 |
| 0.8569444444444444 | 0 |
| 0.8576388888888888 | 0 |
| 0.8583333333333334 | 0 |
| 0.8590277777777778 | 0 |
| 0.8597222222222222 | 0 |
| 0.8604166666666666 | 0 |
| 0.8611111111111112 | 0 |
| 0.8618055555555556 | 0 |
| 0.8624999999999999 | 0 |
| 0.8631944444444444 | 0 |
| 0.8638888888888889 | 0 |
| 0.8645833333333334 | 0 |
| 0.8652777777777777 | 0 |
| 0.8659722222222223 | 0 |
| 0.8666666666666667 | 0 |
| 0.8673611111111111 | 0 |
| 0.8680555555555555 | 0 |
| 0.86875 | 0 |
| 0.8694444444444445 | 0 |
| 0.8701388888888889 | 0 |
| 0.8708333333333332 | 0 |
| 0.8715277777777778 | 0 |
| 0.8722222222222222 | 0 |
| 0.8729166666666667 | 0 |
| 0.873611111111111 | 0 |
| 0.8743055555555556 | 0 |
| 0.875 | 0 |
| 0.8756944444444444 | 0 |
| 0.876388888888889 | 0 |
| 0.8770833333333333 | 0 |
| 0.8777777777777778 | 0 |
| 0.8784722222222222 | 0 |
| 0.8791666666666668 | 0 |
| 0.8798611111111111 | 0 |
| 0.8805555555555555 | 0 |
| 0.88125 | 0 |
| 0.8819444444444445 | 0 |
| 0.8826388888888889 | 0 |
| 0.8833333333333333 | 0 |
| 0.8840277777777777 | 0 |
| 0.8847222222222223 | 0 |
| 0.8854166666666666 | 0 |
| 0.8861111111111111 | 0 |
| 0.8868055555555556 | 0 |
| 0.8875000000000001 | 0 |
| 0.8881944444444444 | 0 |
| 0.8888888888888888 | 0 |
| 0.8895833333333334 | 0 |
| 0.8902777777777778 | 0 |
| 0.8909722222222222 | 0 |
| 0.8916666666666666 | 0 |
| 0.8923611111111112 | 0 |
| 0.8930555555555556 | 0 |
| 0.8937499999999999 | 0 |
| 0.8944444444444444 | 0 |
| 0.8951388888888889 | 0 |
| 0.8958333333333334 | 0 |
| 0.8965277777777777 | 0 |
| 0.8972222222222223 | 0 |
| 0.8979166666666667 | 0 |
| 0.8986111111111111 | 0 |
| 0.8993055555555555 | 0 |
| 0.9 | 0 |
| 0.9006944444444445 | 0 |
| 0.9013888888888889 | 0 |
| 0.9020833333333332 | 0 |
| 0.9027777777777778 | 0 |
| 0.9034722222222222 | 0 |
| 0.9041666666666667 | 0 |
| 0.904861111111111 | 0 |
| 0.9055555555555556 | 0 |
| 0.90625 | 0 |
| 0.9069444444444444 | 0 |
| 0.907638888888889 | 0 |
| 0.9083333333333333 | 0 |
| 0.9090277777777778 | 0 |
| 0.9097222222222222 | 0 |
| 0.9104166666666668 | 0 |
| 0.9111111111111111 | 0 |
| 0.9118055555555555 | 0 |
| 0.9125 | 0 |
| 0.9131944444444445 | 0 |
| 0.9138888888888889 | 0 |
| 0.9145833333333333 | 0 |
| 0.9152777777777777 | 0 |
| 0.9159722222222223 | 0 |
| 0.9166666666666666 | 0 |
| 0.9173611111111111 | 0 |
| 0.9180555555555556 | 0 |
| 0.9187500000000001 | 0 |
| 0.9194444444444444 | 0 |
| 0.9201388888888888 | 0 |
| 0.9208333333333334 | 0 |
| 0.9215277777777778 | 0 |
| 0.9222222222222222 | 0 |
| 0.9229166666666666 | 0 |
| 0.9236111111111112 | 0 |
| 0.9243055555555556 | 0 |
| 0.9249999999999999 | 0 |
| 0.9256944444444444 | 0 |
| 0.9263888888888889 | 0 |
| 0.9270833333333334 | 0 |
| 0.9277777777777777 | 0 |
| 0.9284722222222223 | 0 |
| 0.9291666666666667 | 0 |
| 0.9298611111111111 | 0 |
| 0.9305555555555555 | 0 |
| 0.93125 | 0 |
| 0.9319444444444445 | 0 |
| 0.9326388888888889 | 0 |
| 0.9333333333333332 | 0 |
| 0.9340277777777778 | 0 |
| 0.9347222222222222 | 0 |
| 0.9354166666666667 | 0 |
| 0.936111111111111 | 0 |
| 0.9368055555555556 | 0 |
| 0.9375 | 0 |
| 0.9381944444444444 | 0 |
| 0.938888888888889 | 0 |
| 0.9395833333333333 | 0 |
| 0.9402777777777778 | 0 |
| 0.9409722222222222 | 0 |
| 0.9416666666666668 | 0 |
| 0.9423611111111111 | 0 |
| 0.9430555555555555 | 0 |
| 0.94375 | 0 |
| 0.9444444444444445 | 0 |
| 0.9451388888888889 | 0 |
| 0.9458333333333333 | 0 |
| 0.9465277777777777 | 0 |
| 0.9472222222222223 | 0 |
| 0.9479166666666666 | 0 |
| 0.9486111111111111 | 0 |
| 0.9493055555555556 | 0 |
| 0.9500000000000001 | 0 |
| 0.9506944444444444 | 0 |
| 0.9513888888888888 | 0 |
| 0.9520833333333334 | 0 |
| 0.9527777777777778 | 0 |
| 0.9534722222222222 | 0 |
| 0.9541666666666666 | 0 |
| 0.9548611111111112 | 0 |
| 0.9555555555555556 | 0 |
| 0.9562499999999999 | 0 |
| 0.9569444444444444 | 0 |
| 0.9576388888888889 | 0 |
| 0.9583333333333334 | 0 |
| 0.9590277777777777 | 0 |
| 0.9597222222222223 | 0 |
| 0.9604166666666667 | 0 |
| 0.9611111111111111 | 0 |
| 0.9618055555555555 | 0 |
| 0.9625 | 0 |
| 0.9631944444444445 | 0 |
| 0.9638888888888889 | 0 |
| 0.9645833333333332 | 0 |
| 0.9652777777777778 | 0 |
| 0.9659722222222222 | 0 |
| 0.9666666666666667 | 0 |
| 0.967361111111111 | 0 |
| 0.9680555555555556 | 0 |
| 0.96875 | 0 |
| 0.9694444444444444 | 0 |
| 0.970138888888889 | 0 |
| 0.9708333333333333 | 0 |
| 0.9715277777777778 | 0 |
| 0.9722222222222222 | 0 |
| 0.9729166666666668 | 0 |
| 0.9736111111111111 | 0 |
| 0.9743055555555555 | 0 |
| 0.975 | 0 |
| 0.9756944444444445 | 0 |
| 0.9763888888888889 | 0 |
| 0.9770833333333333 | 0 |
| 0.9777777777777777 | 0 |
| 0.9784722222222223 | 0 |
| 0.9791666666666666 | 0 |
| 0.9798611111111111 | 0 |
| 0.9805555555555556 | 0 |
| 0.9812500000000001 | 0 |
| 0.9819444444444444 | 0 |
| 0.9826388888888888 | 0 |
| 0.9833333333333334 | 0 |
| 0.9840277777777778 | 0 |
| 0.9847222222222222 | 0 |
| 0.9854166666666666 | 0 |
| 0.9861111111111112 | 0 |
| 0.9868055555555556 | 0 |
| 0.9874999999999999 | 0 |
| 0.9881944444444444 | 0 |
| 0.9888888888888889 | 0 |
| 0.9895833333333334 | 0 |
| 0.9902777777777777 | 0 |
| 0.9909722222222223 | 0 |
| 0.9916666666666667 | 0 |
| 0.9923611111111111 | 0 |
| 0.9930555555555555 | 0 |
| 0.99375 | 0 |
| 0.9944444444444445 | 0 |
| 0.9951388888888889 | 0 |
| 0.9958333333333332 | 0 |
| 0.9965277777777778 | 0 |
| 0.9972222222222222 | 0 |
| 0.9979166666666667 | 0 |
| 0.998611111111111 | 0 |
| 0.9993055555555556 | 0 |